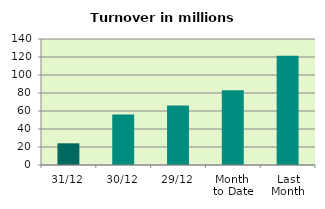
| Category | Series 0 |
|---|---|
| 31/12 | 24.111 |
| 30/12 | 56.219 |
| 29/12 | 66.128 |
| Month 
to Date | 83.19 |
| Last
Month | 121.455 |